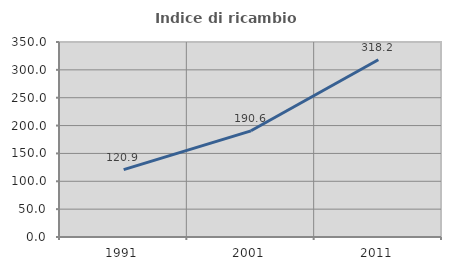
| Category | Indice di ricambio occupazionale  |
|---|---|
| 1991.0 | 120.93 |
| 2001.0 | 190.588 |
| 2011.0 | 318.182 |